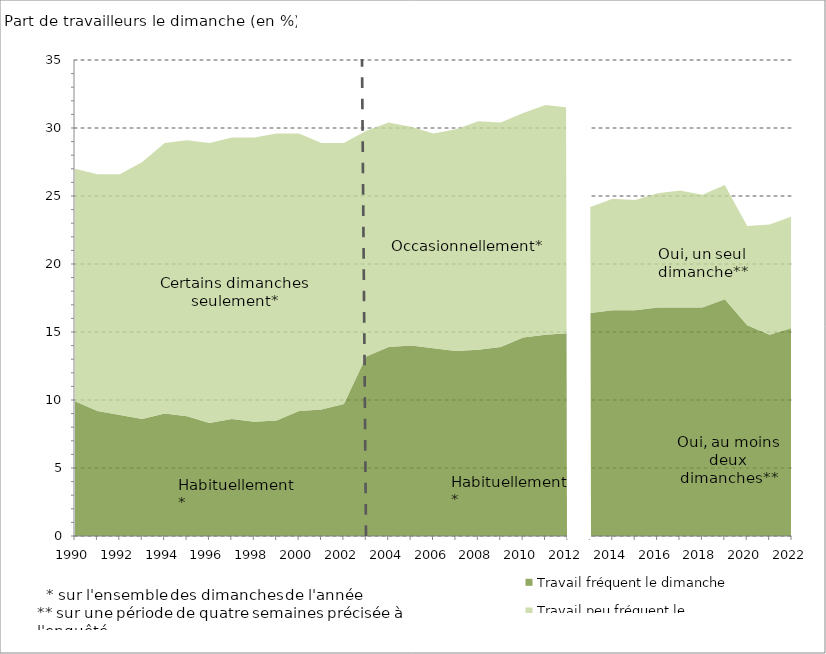
| Category | Travail fréquent le dimanche | Travail peu fréquent le dimanche |
|---|---|---|
| 1990.0 | 9.9 | 17.1 |
| 1991.0 | 9.2 | 17.4 |
| 1992.0 | 8.9 | 17.7 |
| 1993.0 | 8.6 | 18.9 |
| 1994.0 | 9 | 19.9 |
| 1995.0 | 8.8 | 20.3 |
| 1996.0 | 8.3 | 20.6 |
| 1997.0 | 8.6 | 20.7 |
| 1998.0 | 8.4 | 20.9 |
| 1999.0 | 8.5 | 21.1 |
| 2000.0 | 9.2 | 20.4 |
| 2001.0 | 9.3 | 19.6 |
| 2002.0 | 9.7 | 19.2 |
| 2003.0 | 13.2 | 16.6 |
| 2004.0 | 13.9 | 16.5 |
| 2005.0 | 14 | 16.1 |
| 2006.0 | 13.8 | 15.8 |
| 2007.0 | 13.6 | 16.3 |
| 2008.0 | 13.7 | 16.8 |
| 2009.0 | 13.9 | 16.5 |
| 2010.0 | 14.6 | 16.5 |
| 2011.0 | 14.8 | 16.9 |
| 2012.0 | 14.9 | 16.6 |
| 2013.0 | 16.4 | 7.8 |
| 2014.0 | 16.6 | 8.2 |
| 2015.0 | 16.6 | 8.1 |
| 2016.0 | 16.8 | 8.4 |
| 2017.0 | 16.8 | 8.6 |
| 2018.0 | 16.8 | 8.3 |
| 2019.0 | 17.4 | 8.4 |
| 2020.0 | 15.5 | 7.3 |
| 2021.0 | 14.8 | 8.1 |
| 2022.0 | 15.3 | 8.2 |